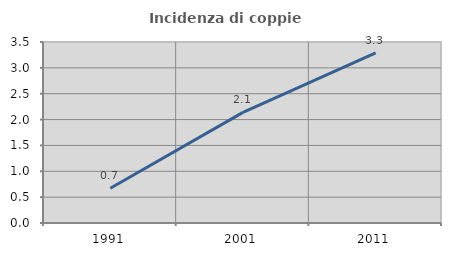
| Category | Incidenza di coppie miste |
|---|---|
| 1991.0 | 0.673 |
| 2001.0 | 2.139 |
| 2011.0 | 3.288 |